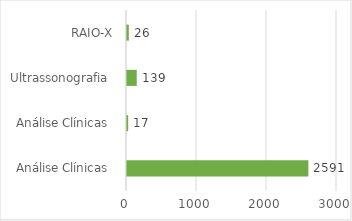
| Category | Series 0 |
|---|---|
| Análise Clínicas  | 2591 |
| Análise Clínicas  | 17 |
| Ultrassonografia  | 139 |
| RAIO-X | 26 |